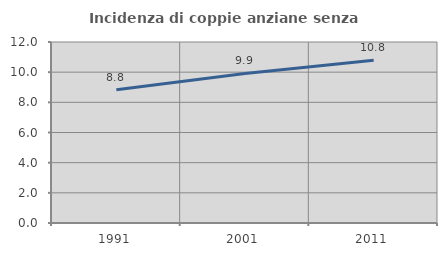
| Category | Incidenza di coppie anziane senza figli  |
|---|---|
| 1991.0 | 8.832 |
| 2001.0 | 9.918 |
| 2011.0 | 10.783 |